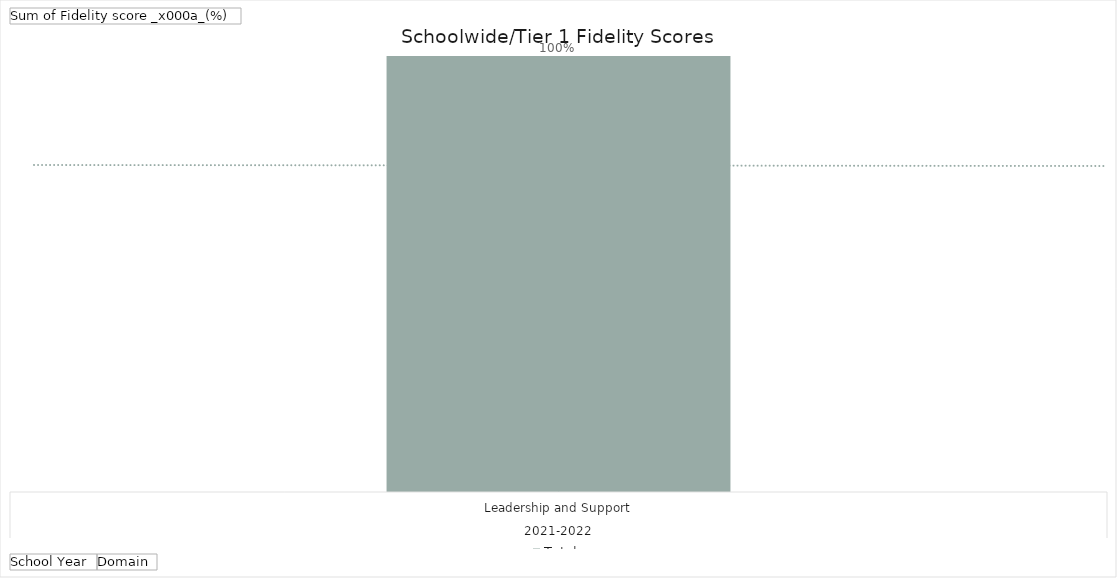
| Category | Total |
|---|---|
| 0 | 1 |